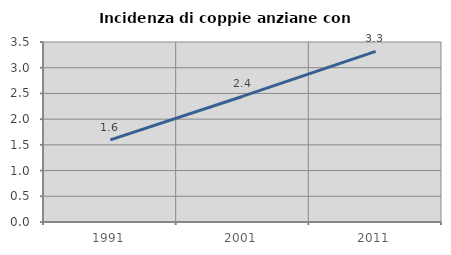
| Category | Incidenza di coppie anziane con figli |
|---|---|
| 1991.0 | 1.597 |
| 2001.0 | 2.446 |
| 2011.0 | 3.319 |